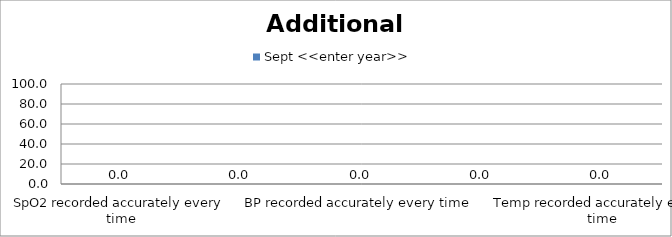
| Category | Sept <<enter year>> |
|---|---|
| SpO2 recorded accurately every time | 0 |
| CRT recorded accurately every time | 0 |
| BP recorded accurately every time | 0 |
| Skin Colour recorded accurately every time | 0 |
| Temp recorded accurately every time | 0 |